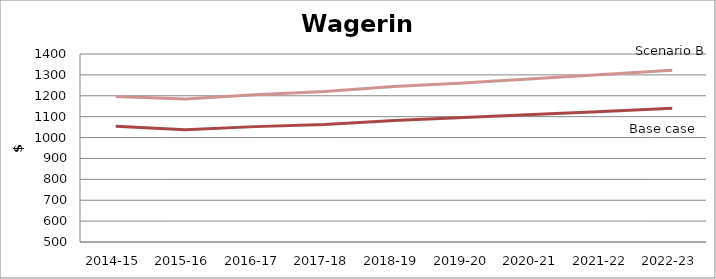
| Category | Base case | Scenario B |
|---|---|---|
| 2014-15 | 1054.342 | 1196.89 |
| 2015-16 | 1037.331 | 1184.459 |
| 2016-17 | 1052.32 | 1204.595 |
| 2017-18 | 1062.918 | 1220.29 |
| 2018-19 | 1081.2 | 1244.413 |
| 2019-20 | 1095.915 | 1260.596 |
| 2020-21 | 1110.561 | 1281.239 |
| 2021-22 | 1125.121 | 1301.406 |
| 2022-23 | 1140.672 | 1322.327 |